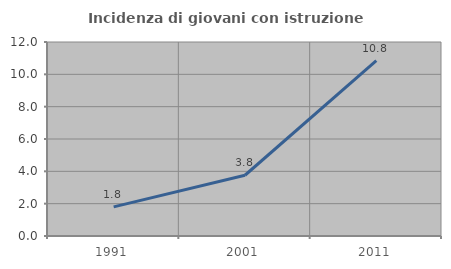
| Category | Incidenza di giovani con istruzione universitaria |
|---|---|
| 1991.0 | 1.8 |
| 2001.0 | 3.758 |
| 2011.0 | 10.843 |